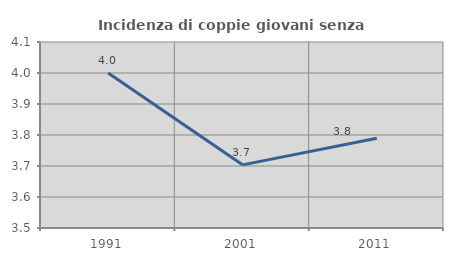
| Category | Incidenza di coppie giovani senza figli |
|---|---|
| 1991.0 | 4 |
| 2001.0 | 3.704 |
| 2011.0 | 3.789 |